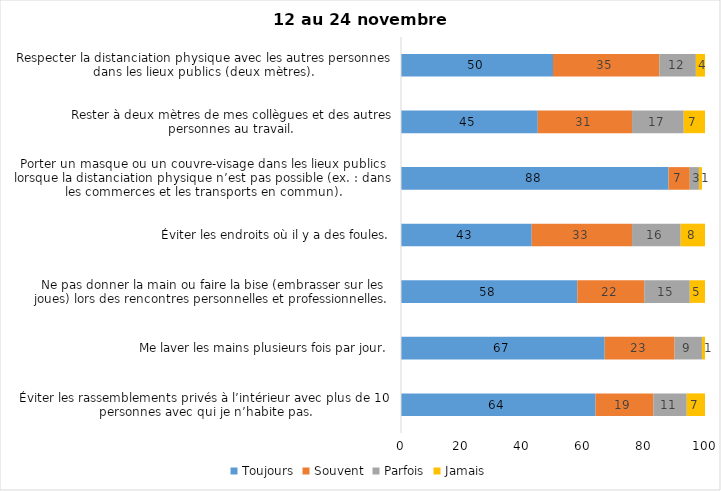
| Category | Toujours | Souvent | Parfois | Jamais |
|---|---|---|---|---|
| Éviter les rassemblements privés à l’intérieur avec plus de 10 personnes avec qui je n’habite pas. | 64 | 19 | 11 | 7 |
| Me laver les mains plusieurs fois par jour. | 67 | 23 | 9 | 1 |
| Ne pas donner la main ou faire la bise (embrasser sur les joues) lors des rencontres personnelles et professionnelles. | 58 | 22 | 15 | 5 |
| Éviter les endroits où il y a des foules. | 43 | 33 | 16 | 8 |
| Porter un masque ou un couvre-visage dans les lieux publics lorsque la distanciation physique n’est pas possible (ex. : dans les commerces et les transports en commun). | 88 | 7 | 3 | 1 |
| Rester à deux mètres de mes collègues et des autres personnes au travail. | 45 | 31 | 17 | 7 |
| Respecter la distanciation physique avec les autres personnes dans les lieux publics (deux mètres). | 50 | 35 | 12 | 4 |